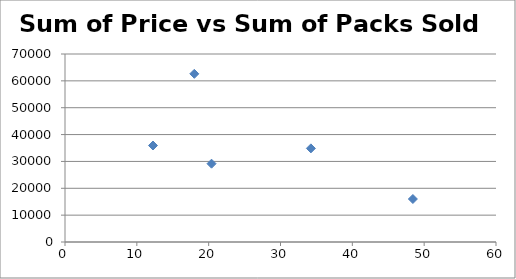
| Category | Sum of Price per pack |
|---|---|
| 12.25 | 35926 |
| 48.43000000000001 | 16009 |
| 20.400000000000002 | 29156 |
| 34.230000000000004 | 34863 |
| 18.0 | 62619 |